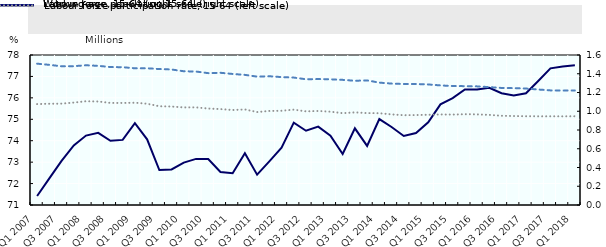
| Category | Labour force participation rate, 15-64 (left scale) |
|---|---|
| Q1 2007 | 71.42 |
| Q2 2007 | 72.243 |
| Q3 2007 | 73.061 |
| Q4 2007 | 73.782 |
| Q1 2008 | 74.24 |
| Q2 2008 | 74.367 |
| Q3 2008 | 73.995 |
| Q4 2008 | 74.038 |
| Q1 2009 | 74.824 |
| Q2 2009 | 74.067 |
| Q3 2009 | 72.633 |
| Q4 2009 | 72.657 |
| Q1 2010 | 72.977 |
| Q2 2010 | 73.151 |
| Q3 2010 | 73.142 |
| Q4 2010 | 72.542 |
| Q1 2011 | 72.486 |
| Q2 2011 | 73.413 |
| Q3 2011 | 72.418 |
| Q4 2011 | 73.038 |
| Q1 2012 | 73.672 |
| Q2 2012 | 74.843 |
| Q3 2012 | 74.466 |
| Q4 2012 | 74.656 |
| Q1 2013 | 74.237 |
| Q2 2013 | 73.38 |
| Q3 2013 | 74.577 |
| Q4 2013 | 73.757 |
| Q1 2014 | 75.01 |
| Q2 2014 | 74.638 |
| Q3 2014 | 74.22 |
| Q4 2014 | 74.356 |
| Q1 2015 | 74.859 |
| Q2 2015 | 75.699 |
| Q3 2015 | 75.986 |
| Q4 2015 | 76.392 |
| Q1 2016 | 76.391 |
| Q2 2016 | 76.472 |
| Q3 2016 | 76.214 |
| Q4 2016 | 76.114 |
| Q1 2017 | 76.213 |
| Q2 2017 | 76.788 |
| Q3 2017 | 77.378 |
| Q4 2017 | 77.464 |
| Q1 2018 | 77.516 |